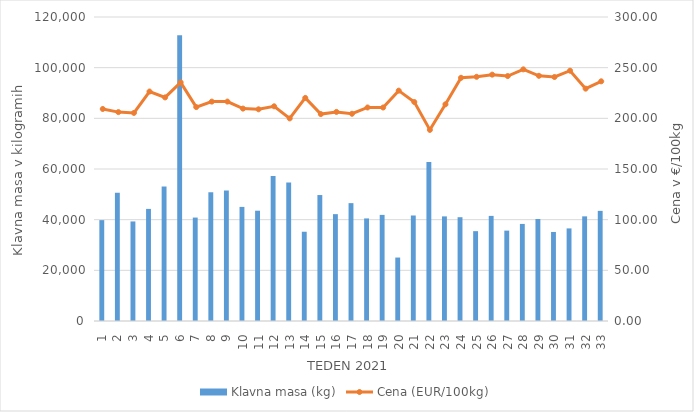
| Category | Klavna masa (kg) |
|---|---|
| 1.0 | 39814 |
| 2.0 | 50603 |
| 3.0 | 39295 |
| 4.0 | 44250 |
| 5.0 | 53061 |
| 6.0 | 112816 |
| 7.0 | 40829 |
| 8.0 | 50775 |
| 9.0 | 51535 |
| 10.0 | 45040 |
| 11.0 | 43536 |
| 12.0 | 57246 |
| 13.0 | 54680 |
| 14.0 | 35237 |
| 15.0 | 49721 |
| 16.0 | 42177 |
| 17.0 | 46525 |
| 18.0 | 40491 |
| 19.0 | 41888 |
| 20.0 | 25048 |
| 21.0 | 41651 |
| 22.0 | 62774 |
| 23.0 | 41297 |
| 24.0 | 40971 |
| 25.0 | 35465 |
| 26.0 | 41489 |
| 27.0 | 35675 |
| 28.0 | 38316 |
| 29.0 | 40265 |
| 30.0 | 35146 |
| 31.0 | 36548 |
| 32.0 | 41314 |
| 33.0 | 43471 |